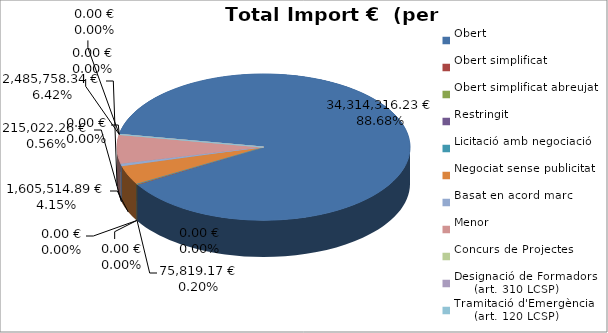
| Category | Total preu
(amb IVA) |
|---|---|
| Obert | 34314316.226 |
| Obert simplificat | 0 |
| Obert simplificat abreujat | 75819.17 |
| Restringit | 0 |
| Licitació amb negociació | 0 |
| Negociat sense publicitat | 1605514.891 |
| Basat en acord marc | 215022.259 |
| Menor | 2485758.34 |
| Concurs de Projectes | 0 |
| Designació de Formadors
     (art. 310 LCSP) | 0 |
| Tramitació d'Emergència
     (art. 120 LCSP) | 0 |